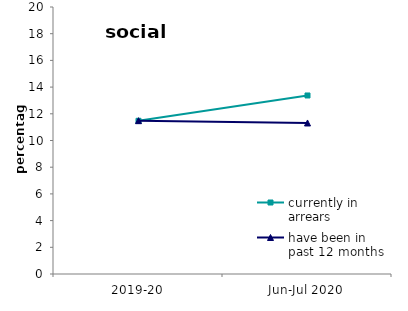
| Category | currently in arrears | have been in past 12 months |
|---|---|---|
| 2019-20 | 11.475 | 11.486 |
| Jun-Jul 2020 | 13.373 | 11.312 |